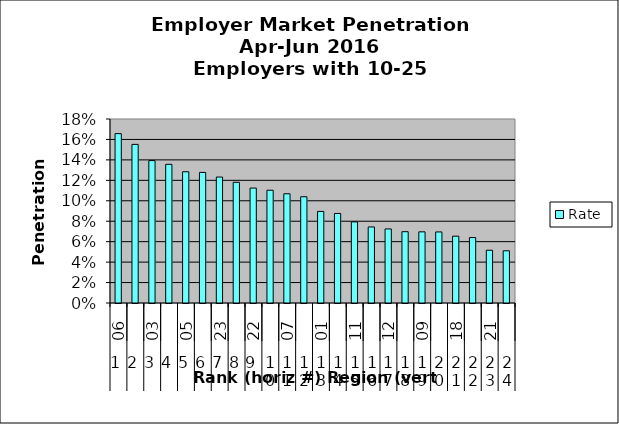
| Category | Rate |
|---|---|
| 0 | 0.166 |
| 1 | 0.155 |
| 2 | 0.139 |
| 3 | 0.136 |
| 4 | 0.128 |
| 5 | 0.128 |
| 6 | 0.123 |
| 7 | 0.118 |
| 8 | 0.112 |
| 9 | 0.11 |
| 10 | 0.107 |
| 11 | 0.104 |
| 12 | 0.09 |
| 13 | 0.088 |
| 14 | 0.079 |
| 15 | 0.074 |
| 16 | 0.072 |
| 17 | 0.07 |
| 18 | 0.07 |
| 19 | 0.07 |
| 20 | 0.065 |
| 21 | 0.064 |
| 22 | 0.052 |
| 23 | 0.051 |